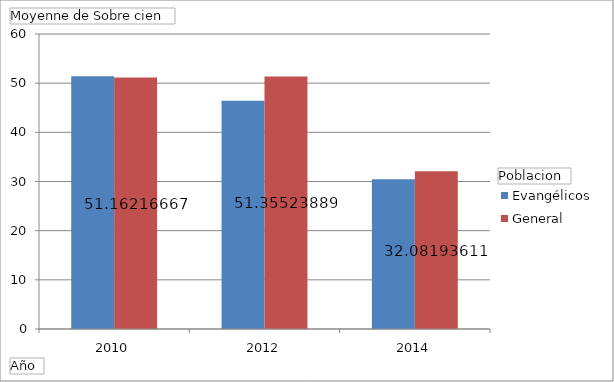
| Category | Evangélicos  | General |
|---|---|---|
| 2010 | 51.431 | 51.162 |
| 2012 | 46.414 | 51.355 |
| 2014 | 30.469 | 32.082 |